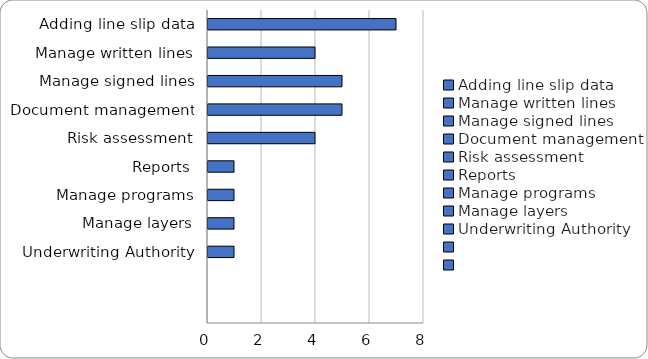
| Category | Series 0 |
|---|---|
| Adding line slip data | 7 |
| Manage written lines | 4 |
| Manage signed lines | 5 |
| Document management | 5 |
| Risk assessment | 4 |
| Reports | 1 |
| Manage programs | 1 |
| Manage layers | 1 |
| Underwriting Authority | 1 |